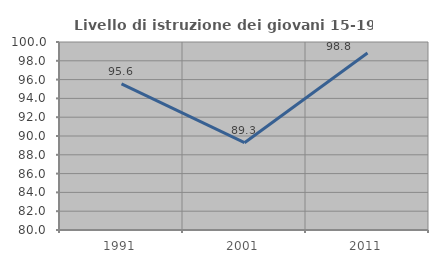
| Category | Livello di istruzione dei giovani 15-19 anni |
|---|---|
| 1991.0 | 95.556 |
| 2001.0 | 89.286 |
| 2011.0 | 98.824 |